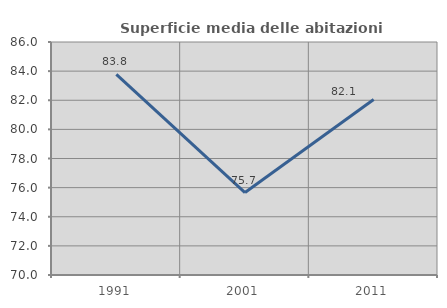
| Category | Superficie media delle abitazioni occupate |
|---|---|
| 1991.0 | 83.777 |
| 2001.0 | 75.662 |
| 2011.0 | 82.051 |